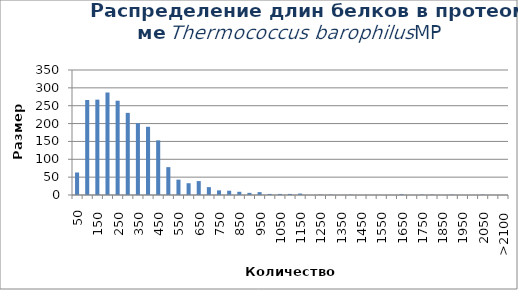
| Category | Частота |
|---|---|
| 50 | 63 |
| 100 | 266 |
| 150 | 267 |
| 200 | 287 |
| 250 | 264 |
| 300 | 230 |
| 350 | 201 |
| 400 | 191 |
| 450 | 153 |
| 500 | 78 |
| 550 | 43 |
| 600 | 33 |
| 650 | 39 |
| 700 | 22 |
| 750 | 13 |
| 800 | 12 |
| 850 | 9 |
| 900 | 6 |
| 950 | 8 |
| 1000 | 3 |
| 1050 | 3 |
| 1100 | 3 |
| 1150 | 4 |
| 1200 | 0 |
| 1250 | 1 |
| 1300 | 1 |
| 1350 | 0 |
| 1400 | 1 |
| 1450 | 0 |
| 1500 | 0 |
| 1550 | 0 |
| 1600 | 0 |
| 1650 | 2 |
| 1700 | 0 |
| 1750 | 1 |
| 1800 | 1 |
| 1850 | 0 |
| 1900 | 1 |
| 1950 | 0 |
| 2000 | 0 |
| 2050 | 1 |
| 2100 | 0 |
| >2100 | 0 |